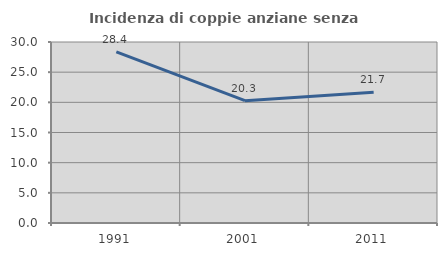
| Category | Incidenza di coppie anziane senza figli  |
|---|---|
| 1991.0 | 28.378 |
| 2001.0 | 20.27 |
| 2011.0 | 21.687 |